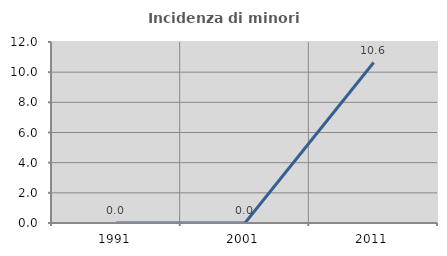
| Category | Incidenza di minori stranieri |
|---|---|
| 1991.0 | 0 |
| 2001.0 | 0 |
| 2011.0 | 10.638 |